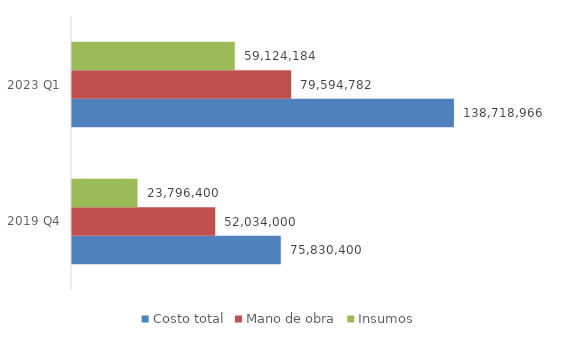
| Category | Costo total | Mano de obra | Insumos |
|---|---|---|---|
| 2019 Q4 | 75830400 | 52034000 | 23796400 |
| 2023 Q1 | 138718965.7 | 79594782 | 59124183.7 |